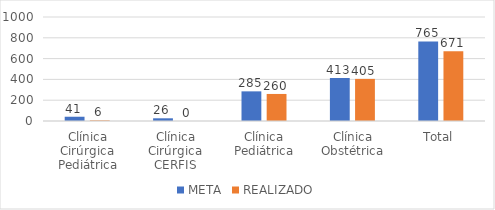
| Category | META | REALIZADO |
|---|---|---|
| Clínica Cirúrgica Pediátrica | 41 | 6 |
| Clínica Cirúrgica CERFIS | 26 | 0 |
| Clínica Pediátrica | 285 | 260 |
| Clínica Obstétrica | 413 | 405 |
| Total | 765 | 671 |